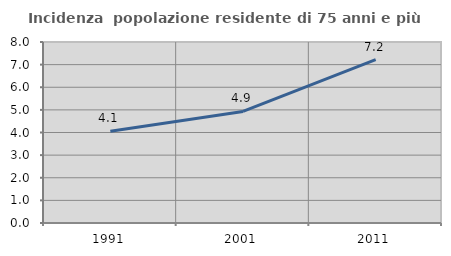
| Category | Incidenza  popolazione residente di 75 anni e più |
|---|---|
| 1991.0 | 4.057 |
| 2001.0 | 4.93 |
| 2011.0 | 7.219 |